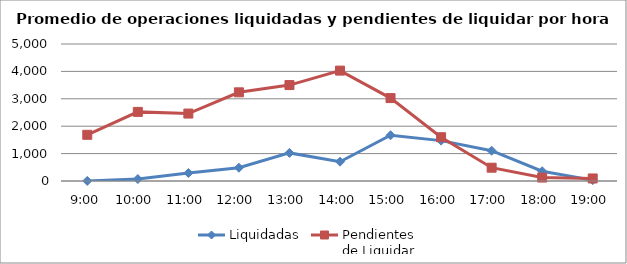
| Category | Liquidadas | Pendientes
de Liquidar |
|---|---|---|
| 0.375 | 1.75 | 1685.75 |
| 0.4166666666666667 | 70.8 | 2522.75 |
| 0.4583333333333333 | 289.8 | 2461 |
| 0.5 | 484.4 | 3236.75 |
| 0.5416666666666666 | 1025.5 | 3501.1 |
| 0.583333333333333 | 703.9 | 4028.4 |
| 0.625 | 1669.9 | 3026.25 |
| 0.666666666666667 | 1473.35 | 1597.75 |
| 0.708333333333333 | 1105.3 | 485.65 |
| 0.75 | 356.5 | 125.45 |
| 0.791666666666667 | 32.35 | 92.85 |